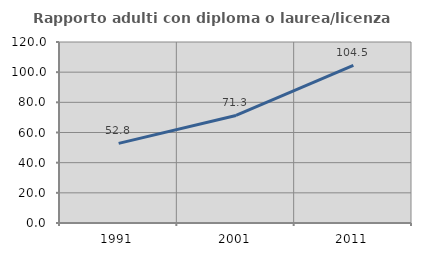
| Category | Rapporto adulti con diploma o laurea/licenza media  |
|---|---|
| 1991.0 | 52.772 |
| 2001.0 | 71.314 |
| 2011.0 | 104.522 |